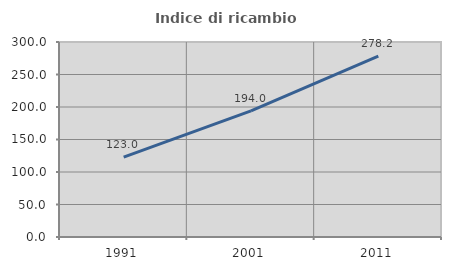
| Category | Indice di ricambio occupazionale  |
|---|---|
| 1991.0 | 122.979 |
| 2001.0 | 193.989 |
| 2011.0 | 278.182 |